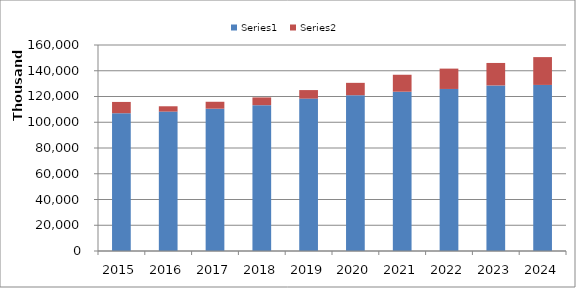
| Category | Series 0 | Series 1 |
|---|---|---|
| 2015.0 | 107024624 | 8752223 |
| 2016.0 | 108281643 | 4127675 |
| 2017.0 | 110530972 | 5378400 |
| 2018.0 | 113264977 | 6029408 |
| 2019.0 | 118355238 | 6629213 |
| 2020.0 | 121006865 | 9599774 |
| 2021.0 | 123724608 | 13166969 |
| 2022.0 | 125855292 | 15805899 |
| 2023.0 | 128586817 | 17468732 |
| 2024.0 | 128983540 | 21615231 |